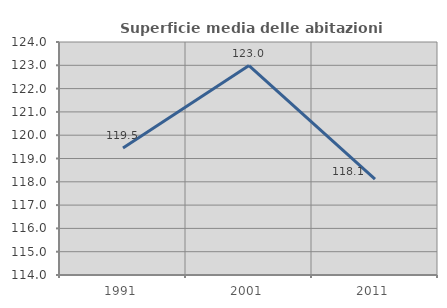
| Category | Superficie media delle abitazioni occupate |
|---|---|
| 1991.0 | 119.454 |
| 2001.0 | 122.989 |
| 2011.0 | 118.11 |